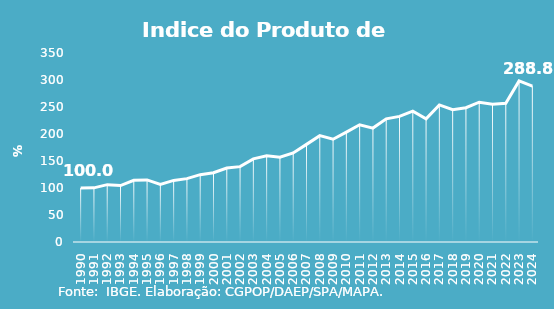
| Category | Indice de Prod. base 1990 |
|---|---|
| 1990.0 | 100 |
| 1991.0 | 100.275 |
| 1992.0 | 106.203 |
| 1993.0 | 104.57 |
| 1994.0 | 114.164 |
| 1995.0 | 115.024 |
| 1996.0 | 106.552 |
| 1997.0 | 114.037 |
| 1998.0 | 117.319 |
| 1999.0 | 124.734 |
| 2000.0 | 128.293 |
| 2001.0 | 136.975 |
| 2002.0 | 139.51 |
| 2003.0 | 153.868 |
| 2004.0 | 159.641 |
| 2005.0 | 157.136 |
| 2006.0 | 164.858 |
| 2007.0 | 180.781 |
| 2008.0 | 196.91 |
| 2009.0 | 190.309 |
| 2010.0 | 203.581 |
| 2011.0 | 217.041 |
| 2012.0 | 210.932 |
| 2013.0 | 228.009 |
| 2014.0 | 232.562 |
| 2015.0 | 242.318 |
| 2016.0 | 228.239 |
| 2017.0 | 253.826 |
| 2018.0 | 245.134 |
| 2019.0 | 248.619 |
| 2020.0 | 258.848 |
| 2021.0 | 254.988 |
| 2022.0 | 256.904 |
| 2023.0 | 298.269 |
| 2024.0 | 288.797 |